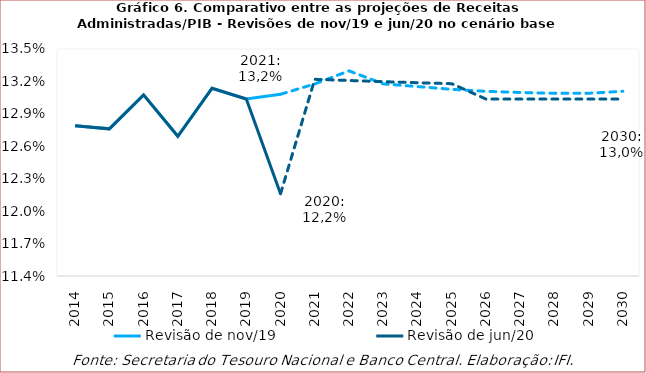
| Category | Revisão de nov/19 | Revisão de jun/20 |
|---|---|---|
| 2014.0 | 0.128 | 0.128 |
| 2015.0 | 0.128 | 0.128 |
| 2016.0 | 0.131 | 0.131 |
| 2017.0 | 0.127 | 0.127 |
| 2018.0 | 0.131 | 0.131 |
| 2019.0 | 0.13 | 0.13 |
| 2020.0 | 0.131 | 0.122 |
| 2021.0 | 0.132 | 0.132 |
| 2022.0 | 0.133 | 0.132 |
| 2023.0 | 0.132 | 0.132 |
| 2024.0 | 0.132 | 0.132 |
| 2025.0 | 0.131 | 0.132 |
| 2026.0 | 0.131 | 0.13 |
| 2027.0 | 0.131 | 0.13 |
| 2028.0 | 0.131 | 0.13 |
| 2029.0 | 0.131 | 0.13 |
| 2030.0 | 0.131 | 0.13 |